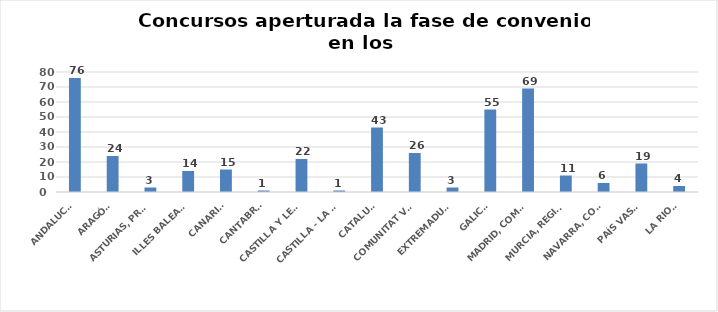
| Category | Series 0 |
|---|---|
| ANDALUCÍA | 76 |
| ARAGÓN | 24 |
| ASTURIAS, PRINCIPADO | 3 |
| ILLES BALEARS | 14 |
| CANARIAS | 15 |
| CANTABRIA | 1 |
| CASTILLA Y LEÓN | 22 |
| CASTILLA - LA MANCHA | 1 |
| CATALUÑA | 43 |
| COMUNITAT VALENCIANA | 26 |
| EXTREMADURA | 3 |
| GALICIA | 55 |
| MADRID, COMUNIDAD | 69 |
| MURCIA, REGIÓN | 11 |
| NAVARRA, COM. FORAL | 6 |
| PAÍS VASCO | 19 |
| LA RIOJA | 4 |